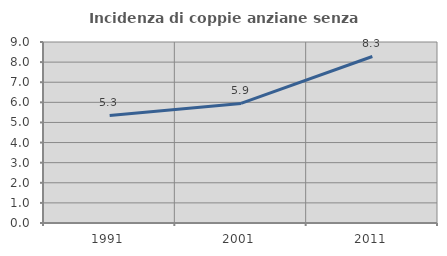
| Category | Incidenza di coppie anziane senza figli  |
|---|---|
| 1991.0 | 5.346 |
| 2001.0 | 5.947 |
| 2011.0 | 8.279 |